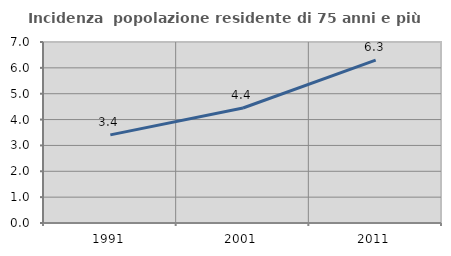
| Category | Incidenza  popolazione residente di 75 anni e più |
|---|---|
| 1991.0 | 3.409 |
| 2001.0 | 4.448 |
| 2011.0 | 6.296 |